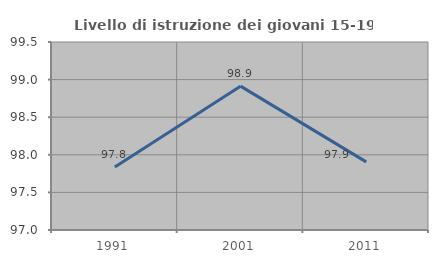
| Category | Livello di istruzione dei giovani 15-19 anni |
|---|---|
| 1991.0 | 97.838 |
| 2001.0 | 98.913 |
| 2011.0 | 97.906 |